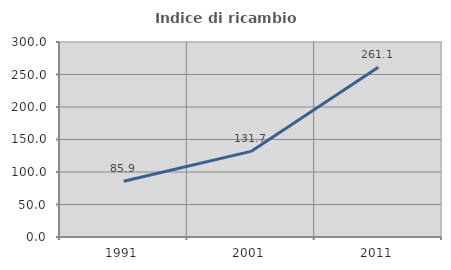
| Category | Indice di ricambio occupazionale  |
|---|---|
| 1991.0 | 85.876 |
| 2001.0 | 131.711 |
| 2011.0 | 261.06 |